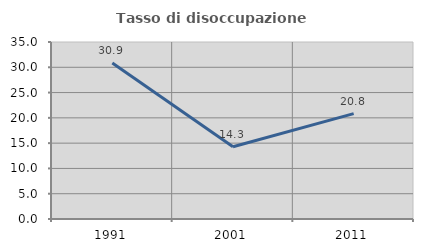
| Category | Tasso di disoccupazione giovanile  |
|---|---|
| 1991.0 | 30.851 |
| 2001.0 | 14.286 |
| 2011.0 | 20.833 |